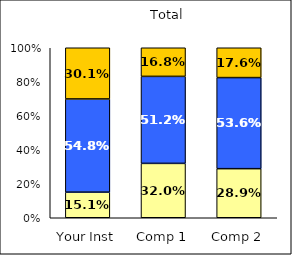
| Category | Low Civic Awareness | Average Civic Awareness | High Civic Awareness |
|---|---|---|---|
| Your Inst | 0.151 | 0.548 | 0.301 |
| Comp 1 | 0.32 | 0.512 | 0.168 |
| Comp 2 | 0.289 | 0.536 | 0.176 |